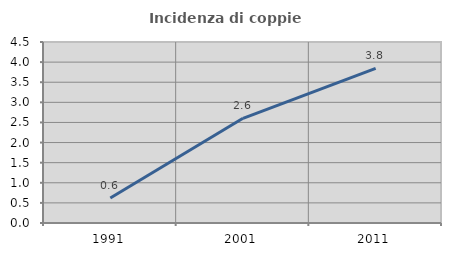
| Category | Incidenza di coppie miste |
|---|---|
| 1991.0 | 0.62 |
| 2001.0 | 2.602 |
| 2011.0 | 3.846 |